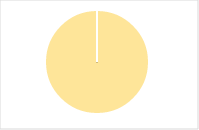
| Category | Total |
|---|---|
| Y | 0 |
| R | 0 |
| T | 0 |
| M | 0 |
| F | 0 |
| N | 11 |